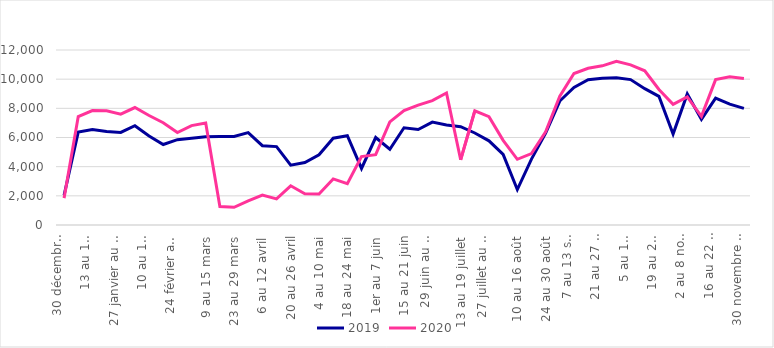
| Category | 2019 | 2020 |
|---|---|---|
| 30 décembre au 5 janvier | 2040 | 1843 |
| 6 au 12 janvier | 6370 | 7439 |
| 13 au 19 janvier | 6554 | 7851 |
| 20 au 26 janvier | 6407 | 7827 |
| 27 janvier au 2 février | 6351 | 7604 |
| 3 au 9 février | 6808 | 8055 |
| 10 au 16 février | 6108 | 7511 |
| 17 au 23 février | 5521 | 7017 |
| 24 février au 1er mars | 5849 | 6337 |
| 2 au 8 mars | 5944 | 6815 |
| 9 au 15 mars | 6046 | 6990 |
| 16 au 22 mars | 6069 | 1263 |
| 23 au 29 mars | 6072 | 1214 |
| 30 mars au 5 avril | 6339 | 1651 |
| 6 au 12 avril | 5437 | 2049 |
| 13 au 19 avril | 5376 | 1788 |
| 20 au 26 avril | 4100 | 2688 |
| 27 avril au 3 mai | 4284 | 2147 |
| 4 au 10 mai | 4818 | 2130 |
| 11 au 17 mai | 5953 | 3160 |
| 18 au 24 mai | 6120 | 2831 |
| 25 au 31 mai | 3877 | 4692 |
| 1er au 7 juin | 5999 | 4826 |
| 8 au 14 juin | 5197 | 7069 |
| 15 au 21 juin | 6668 | 7846 |
| 22 au 28 juin | 6548 | 8224 |
| 29 juin au 5 juillet | 7057 | 8533 |
| 6 au 12 juillet | 6862 | 9058 |
| 13 au 19 juillet | 6737 | 4471 |
| 20 au 26 juillet | 6309 | 7829 |
| 27 juillet au 2 août | 5772 | 7428 |
| 3 au 9 août | 4840 | 5806 |
| 10 au 16 août | 2432 | 4506 |
| 17 au 23 août | 4517 | 4901 |
| 24 au 30 août | 6304 | 6390 |
| 31 août au 6 septembre | 8500 | 8835 |
| 7 au 13 septembre | 9436 | 10385 |
| 14 au 20 septembre | 9967 | 10746 |
| 21 au 27 septembre | 10067 | 10913 |
| 28 septembre au 4 octobre | 10096 | 11229 |
| 5 au 11 octobre | 9971 | 10983 |
| 12 au 18 octobre | 9350 | 10576 |
| 19 au 25 octobre | 8823 | 9292 |
| 26 octobre au 1er novembre | 6232 | 8272 |
| 2 au 8 novembre | 8987 | 8779 |
| 9 au 15 novembre | 7238 | 7452 |
| 16 au 22 novembre | 8705 | 9970 |
| 23 au 29 novembre | 8290 | 10166 |
| 30 novembre au 6 décembre | 8001 | 10044 |